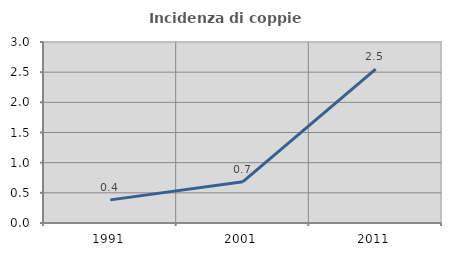
| Category | Incidenza di coppie miste |
|---|---|
| 1991.0 | 0.383 |
| 2001.0 | 0.685 |
| 2011.0 | 2.55 |